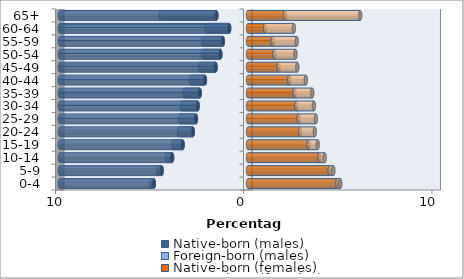
| Category | Native-born (males) | Foreign-born (males) | Native-born (females) | Foreign-born (females) |
|---|---|---|---|---|
| 0-4 | -5.002 | -0.151 | 4.751 | 0.154 |
| 5-9 | -4.587 | -0.188 | 4.344 | 0.191 |
| 10-14 | -4.031 | -0.273 | 3.796 | 0.277 |
| 15-19 | -3.471 | -0.481 | 3.213 | 0.494 |
| 20-24 | -2.931 | -0.739 | 2.767 | 0.781 |
| 25-29 | -2.765 | -0.834 | 2.689 | 0.917 |
| 30-34 | -2.673 | -0.823 | 2.568 | 0.935 |
| 35-39 | -2.561 | -0.809 | 2.475 | 0.939 |
| 40-44 | -2.288 | -0.743 | 2.196 | 0.878 |
| 45-49 | -1.72 | -0.832 | 1.625 | 0.998 |
| 50-54 | -1.467 | -0.924 | 1.409 | 1.112 |
| 55-59 | -1.334 | -1.046 | 1.315 | 1.273 |
| 60-64 | -0.999 | -1.194 | 0.911 | 1.525 |
| 65+ | -1.677 | -2.964 | 1.968 | 3.993 |